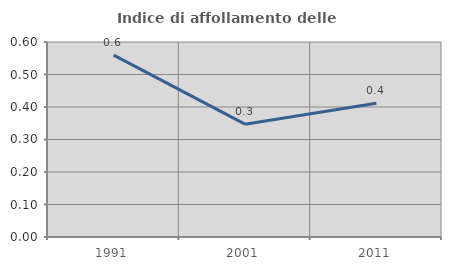
| Category | Indice di affollamento delle abitazioni  |
|---|---|
| 1991.0 | 0.56 |
| 2001.0 | 0.347 |
| 2011.0 | 0.412 |